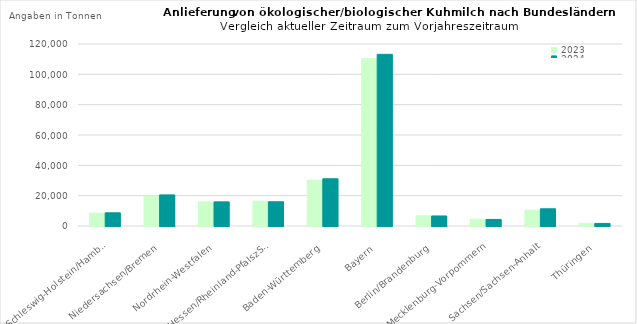
| Category | 2023 | 2024 |
|---|---|---|
| Schleswig-Holstein/Hamburg | 8490.888 | 8693.609 |
| Niedersachsen/Bremen | 19595.827 | 20495.792 |
| Nordrhein-Westfalen | 15919.31 | 15921.656 |
| Hessen/Rheinland-PfalszSaarland | 16398.353 | 15980.553 |
| Baden-Württemberg | 30244.442 | 31141.805 |
| Bayern | 110266.507 | 113180.487 |
| Berlin/Brandenburg | 6745.508 | 6618.849 |
| Mecklenburg-Vorpommern | 4530.578 | 4333.39 |
| Sachsen/Sachsen-Anhalt | 10476.385 | 11350.82 |
| Thüringen | 1706.077 | 1687.158 |